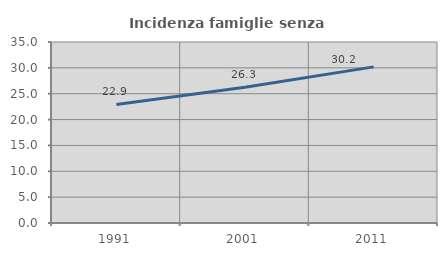
| Category | Incidenza famiglie senza nuclei |
|---|---|
| 1991.0 | 22.92 |
| 2001.0 | 26.256 |
| 2011.0 | 30.193 |